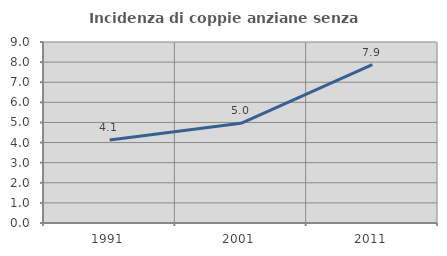
| Category | Incidenza di coppie anziane senza figli  |
|---|---|
| 1991.0 | 4.13 |
| 2001.0 | 4.956 |
| 2011.0 | 7.875 |